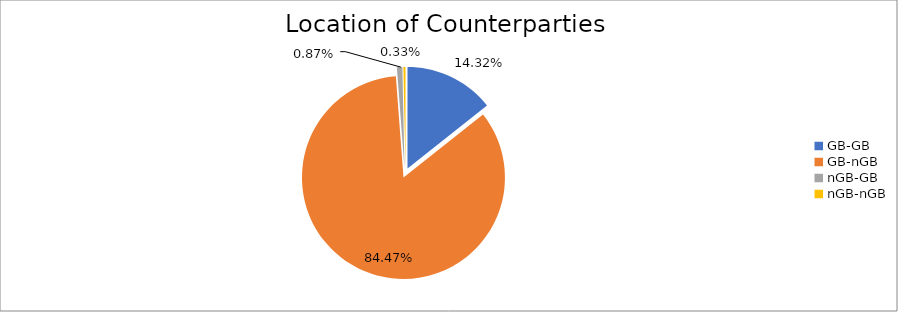
| Category | Series 0 |
|---|---|
| GB-GB | 1371064.675 |
| GB-nGB | 8085477.735 |
| nGB-GB | 82986.988 |
| nGB-nGB | 32008.241 |